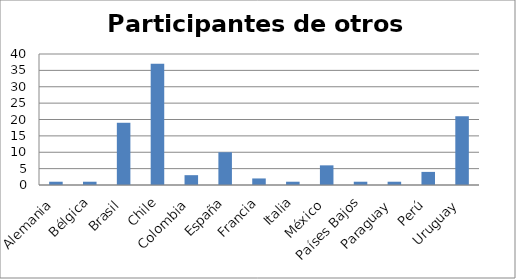
| Category | Series 0 |
|---|---|
| Alemania | 1 |
| Bélgica | 1 |
| Brasil | 19 |
| Chile | 37 |
| Colombia | 3 |
| España | 10 |
| Francia | 2 |
| Italia | 1 |
| México | 6 |
| Países Bajos | 1 |
| Paraguay | 1 |
| Perú | 4 |
| Uruguay | 21 |